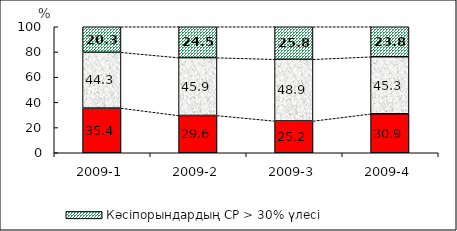
| Category | Кәсіпорындардың СР < 5% үлесі | Кәсіпорындардың 5≤ СР≤ 30% үлесі | Кәсіпорындардың СР > 30% үлесі |
|---|---|---|---|
| 2009-1 | 35.443 | 44.297 | 20.26 |
| 2009-2 | 29.594 | 45.905 | 24.501 |
| 2009-3 | 25.241 | 48.948 | 25.811 |
| 2009-4 | 30.913 | 45.291 | 23.796 |